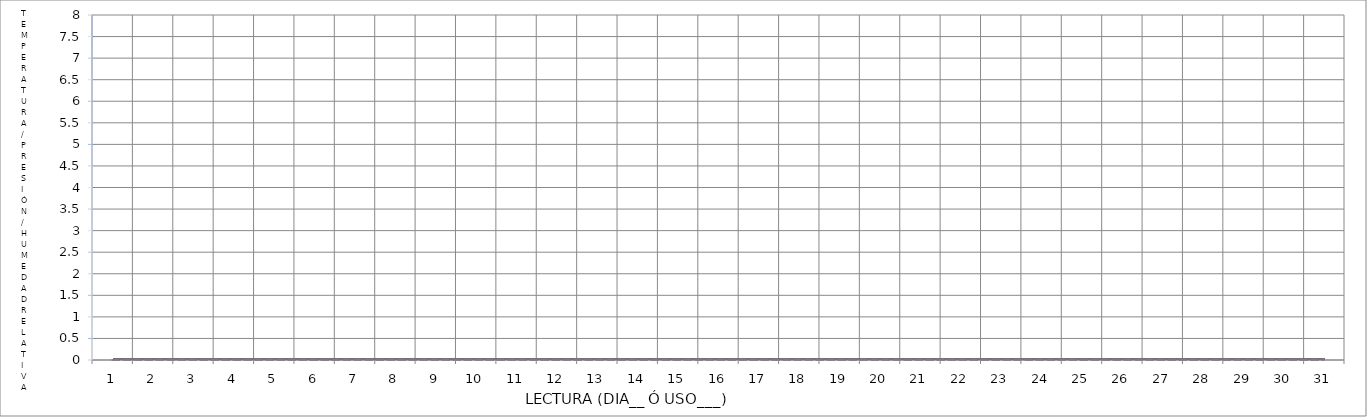
| Category | LSM | LIM | promedio | Series 0 | Series 1 | Series 2 | Series 3 |
|---|---|---|---|---|---|---|---|
| 0 | 11.1 | -11.1 | 0 |  |  |  |  |
| 1 | 11.1 | -11.1 | 0 |  |  |  |  |
| 2 | 11.1 | -11.1 | 0 |  |  |  |  |
| 3 | 11.1 | -11.1 | 0 |  |  |  |  |
| 4 | 11.1 | -11.1 | 0 |  |  |  |  |
| 5 | 11.1 | -11.1 | 0 |  |  |  |  |
| 6 | 11.1 | -11.1 | 0 |  |  |  |  |
| 7 | 11.1 | -11.1 | 0 |  |  |  |  |
| 8 | 11.1 | -11.1 | 0 |  |  |  |  |
| 9 | 11.1 | -11.1 | 0 |  |  |  |  |
| 10 | 11.1 | -11.1 | 0 |  |  |  |  |
| 11 | 11.1 | -11.1 | 0 |  |  |  |  |
| 12 | 11.1 | -11.1 | 0 |  |  |  |  |
| 13 | 11.1 | -11.1 | 0 |  |  |  |  |
| 14 | 11.1 | -11.1 | 0 |  |  |  |  |
| 15 | 11.1 | -11.1 | 0 |  |  |  |  |
| 16 | 11.1 | -11.1 | 0 |  |  |  |  |
| 17 | 11.1 | -11.1 | 0 |  |  |  |  |
| 18 | 11.1 | -11.1 | 0 |  |  |  |  |
| 19 | 11.1 | -11.1 | 0 |  |  |  |  |
| 20 | 11.1 | -11.1 | 0 |  |  |  |  |
| 21 | 11.1 | -11.1 | 0 |  |  |  |  |
| 22 | 11.1 | -11.1 | 0 |  |  |  |  |
| 23 | 11.1 | -11.1 | 0 |  |  |  |  |
| 24 | 11.1 | -11.1 | 0 |  |  |  |  |
| 25 | 11.1 | -11.1 | 0 |  |  |  |  |
| 26 | 11.1 | -11.1 | 0 |  |  |  |  |
| 27 | 11.1 | -11.1 | 0 |  |  |  |  |
| 28 | 11.1 | -11.1 | 0 |  |  |  |  |
| 29 | 11.1 | -11.1 | 0 |  |  |  |  |
| 30 | 11.1 | -11.1 | 0 |  |  |  |  |